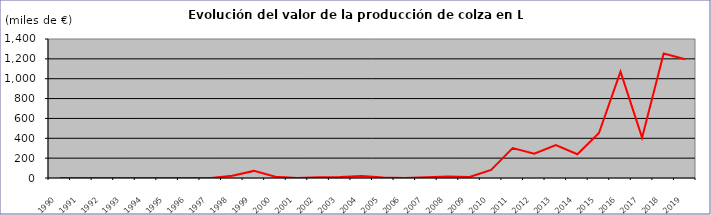
| Category | VALOR
(miles de €) |
|---|---|
| 1990.0 | 0 |
| 1991.0 | 0 |
| 1992.0 | 0 |
| 1993.0 | 0 |
| 1994.0 | 0 |
| 1995.0 | 0 |
| 1996.0 | 0 |
| 1997.0 | 0 |
| 1998.0 | 22.196 |
| 1999.0 | 71.478 |
| 2000.0 | 12.249 |
| 2001.0 | 1.172 |
| 2002.0 | 6.49 |
| 2003.0 | 9.23 |
| 2004.0 | 20.83 |
| 2005.0 | 4.15 |
| 2006.0 | 0 |
| 2007.0 | 7.98 |
| 2008.0 | 15.06 |
| 2009.0 | 10.5 |
| 2010.0 | 81.9 |
| 2011.0 | 301.9 |
| 2012.0 | 245.7 |
| 2013.0 | 332.64 |
| 2014.0 | 239.5 |
| 2015.0 | 453.56 |
| 2016.0 | 1071.16 |
| 2017.0 | 406.28 |
| 2018.0 | 1253.83 |
| 2019.0 | 1196.51 |